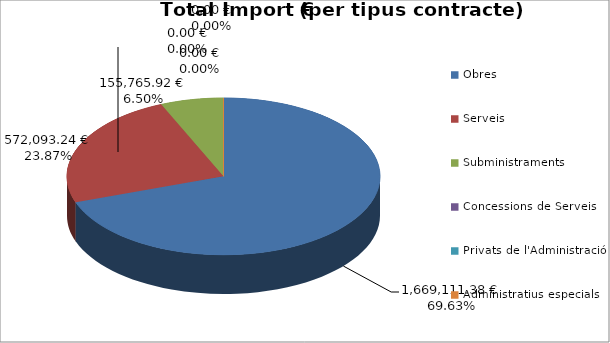
| Category | Total preu              (amb iva) |
|---|---|
| Obres | 1669111.38 |
| Serveis | 572093.24 |
| Subministraments | 155765.92 |
| Concessions de Serveis | 0 |
| Privats de l'Administració | 0 |
| Administratius especials | 0 |